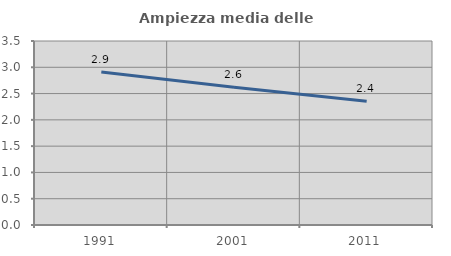
| Category | Ampiezza media delle famiglie |
|---|---|
| 1991.0 | 2.909 |
| 2001.0 | 2.621 |
| 2011.0 | 2.352 |